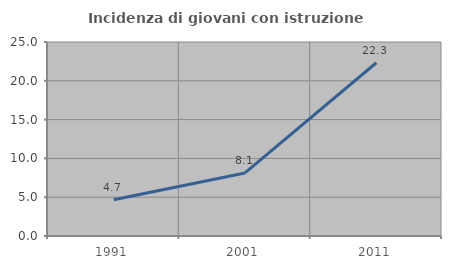
| Category | Incidenza di giovani con istruzione universitaria |
|---|---|
| 1991.0 | 4.663 |
| 2001.0 | 8.13 |
| 2011.0 | 22.326 |